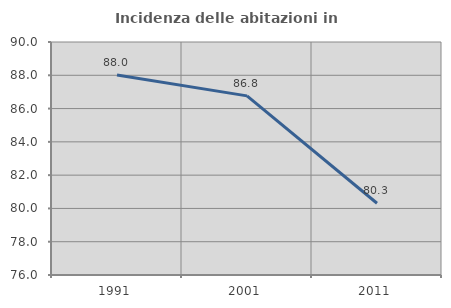
| Category | Incidenza delle abitazioni in proprietà  |
|---|---|
| 1991.0 | 88.022 |
| 2001.0 | 86.763 |
| 2011.0 | 80.312 |